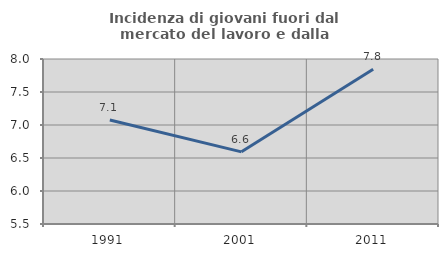
| Category | Incidenza di giovani fuori dal mercato del lavoro e dalla formazione  |
|---|---|
| 1991.0 | 7.075 |
| 2001.0 | 6.593 |
| 2011.0 | 7.843 |